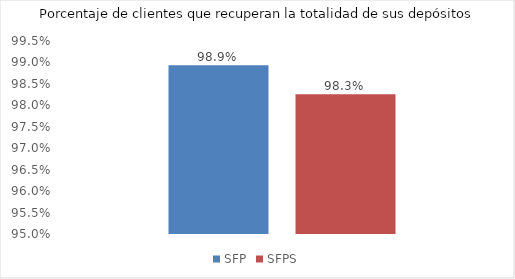
| Category | SFP | SFPS |
|---|---|---|
| 0 | 0.989 | 0.983 |